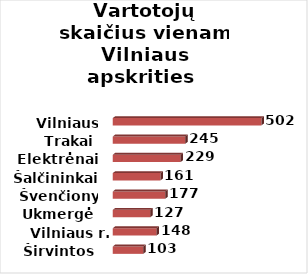
| Category | Series 0 |
|---|---|
| Širvintos | 103 |
| Vilniaus r. | 148 |
| Ukmergė | 127 |
| Švenčionys | 177 |
| Šalčininkai | 161 |
| Elektrėnai | 229 |
| Trakai | 245 |
| Vilniaus m. | 502 |